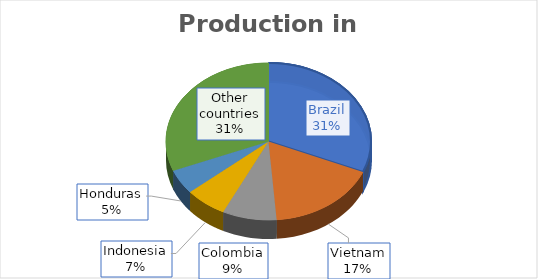
| Category | Production in 2017 |
|---|---|
| {{prod.country}} | 0 |